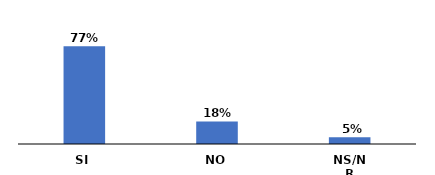
| Category | Series 0 |
|---|---|
| SI | 0.77 |
| NO | 0.177 |
| NS/NR | 0.053 |